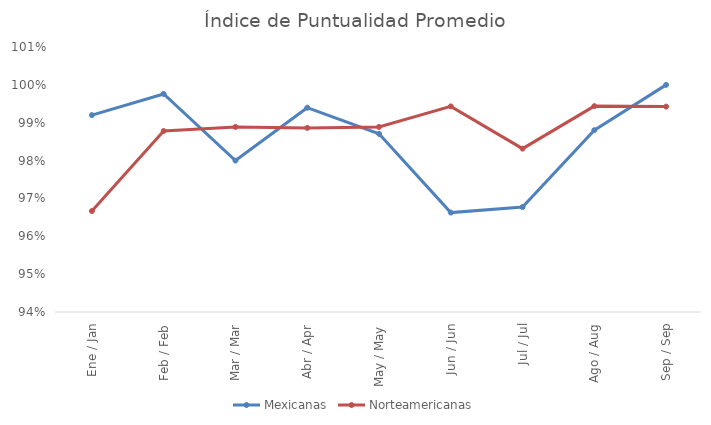
| Category | Mexicanas | Norteamericanas |
|---|---|---|
| Ene / Jan | 0.992 | 0.967 |
| Feb / Feb | 0.998 | 0.988 |
| Mar / Mar | 0.98 | 0.989 |
| Abr / Apr | 0.994 | 0.989 |
| May / May | 0.987 | 0.989 |
| Jun / Jun | 0.966 | 0.994 |
| Jul / Jul | 0.968 | 0.983 |
| Ago / Aug | 0.988 | 0.994 |
| Sep / Sep | 1 | 0.994 |